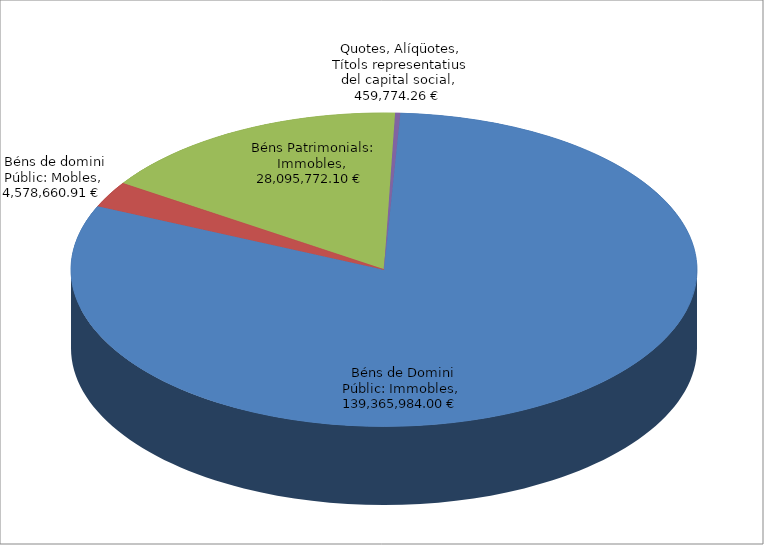
| Category | Series 0 |
|---|---|
| Béns de Domini Públic: Immobles | 139365984 |
| Béns de domini Públic: Mobles | 4578660.91 |
| Béns Patrimonials: Immobles | 28095772.1 |
| Quotes, Alíqüotes, Títols representatius del capital social | 459774.26 |